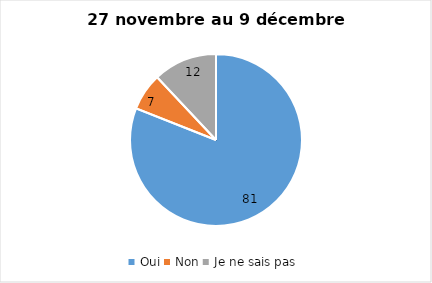
| Category | Series 0 |
|---|---|
| Oui | 81 |
| Non | 7 |
| Je ne sais pas | 12 |